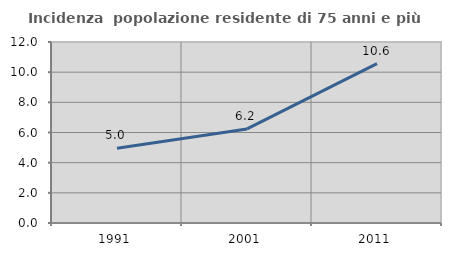
| Category | Incidenza  popolazione residente di 75 anni e più |
|---|---|
| 1991.0 | 4.963 |
| 2001.0 | 6.239 |
| 2011.0 | 10.561 |